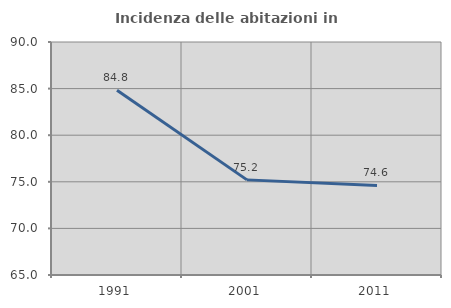
| Category | Incidenza delle abitazioni in proprietà  |
|---|---|
| 1991.0 | 84.821 |
| 2001.0 | 75.207 |
| 2011.0 | 74.615 |